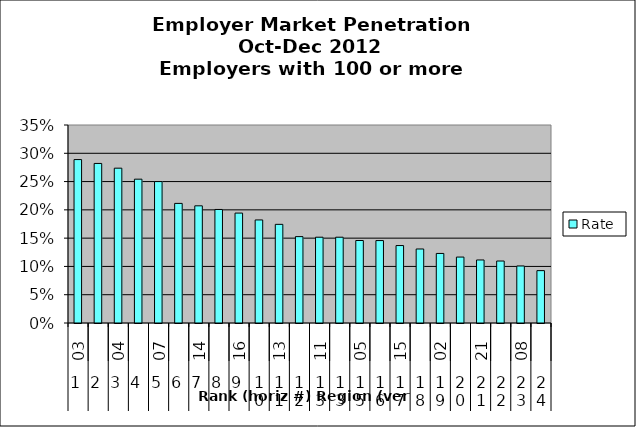
| Category | Rate |
|---|---|
| 0 | 0.289 |
| 1 | 0.282 |
| 2 | 0.274 |
| 3 | 0.254 |
| 4 | 0.25 |
| 5 | 0.211 |
| 6 | 0.207 |
| 7 | 0.201 |
| 8 | 0.194 |
| 9 | 0.182 |
| 10 | 0.174 |
| 11 | 0.153 |
| 12 | 0.152 |
| 13 | 0.152 |
| 14 | 0.146 |
| 15 | 0.146 |
| 16 | 0.137 |
| 17 | 0.131 |
| 18 | 0.123 |
| 19 | 0.117 |
| 20 | 0.111 |
| 21 | 0.11 |
| 22 | 0.101 |
| 23 | 0.093 |